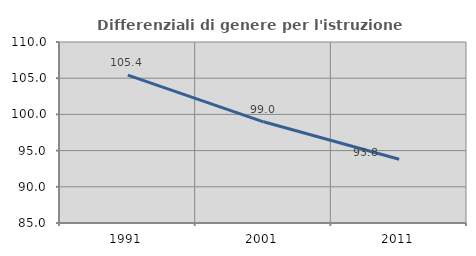
| Category | Differenziali di genere per l'istruzione superiore |
|---|---|
| 1991.0 | 105.415 |
| 2001.0 | 98.978 |
| 2011.0 | 93.809 |